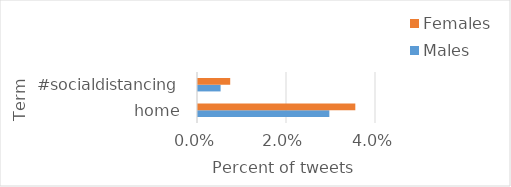
| Category | Males | Females |
|---|---|---|
| home | 0.03 | 0.035 |
| #socialdistancing | 0.005 | 0.007 |